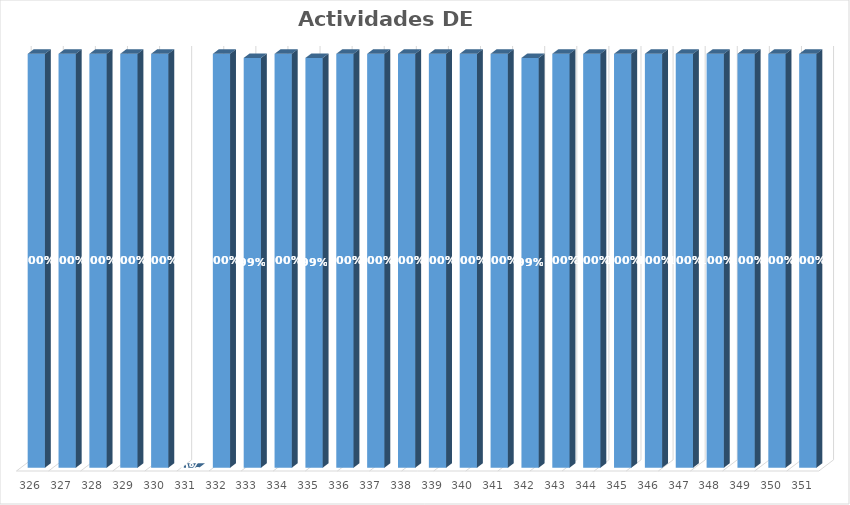
| Category | % Avance |
|---|---|
| 326.0 | 1 |
| 327.0 | 1 |
| 328.0 | 1 |
| 329.0 | 1 |
| 330.0 | 1 |
| 331.0 | 0 |
| 332.0 | 1 |
| 333.0 | 0.99 |
| 334.0 | 1 |
| 335.0 | 0.99 |
| 336.0 | 1 |
| 337.0 | 1 |
| 338.0 | 1 |
| 339.0 | 1 |
| 340.0 | 1 |
| 341.0 | 1 |
| 342.0 | 0.99 |
| 343.0 | 1 |
| 344.0 | 1 |
| 345.0 | 1 |
| 346.0 | 1 |
| 347.0 | 1 |
| 348.0 | 1 |
| 349.0 | 1 |
| 350.0 | 1 |
| 351.0 | 1 |